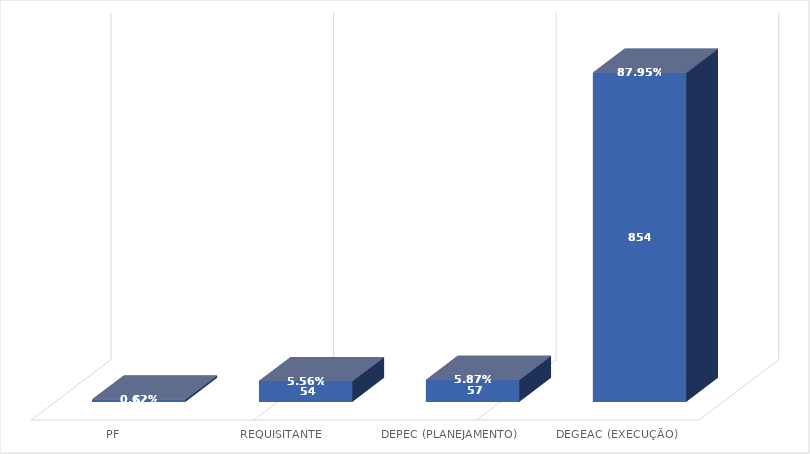
| Category | Soma de Quantidade de itens | Soma de Quantidade de itens2 |
|---|---|---|
| PF | 6 | 0.006 |
| REQUISITANTE | 54 | 0.056 |
| DEPEC (PLANEJAMENTO) | 57 | 0.059 |
| DEGEAC (EXECUÇÃO) | 854 | 0.88 |